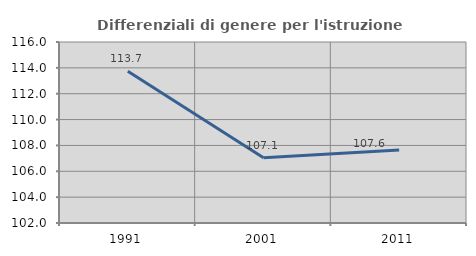
| Category | Differenziali di genere per l'istruzione superiore |
|---|---|
| 1991.0 | 113.744 |
| 2001.0 | 107.05 |
| 2011.0 | 107.64 |